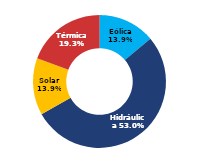
| Category | Sur |
|---|---|
| Eólica | 67.296 |
| Hidráulica | 257.139 |
| Solar | 67.235 |
| Térmica | 93.741 |